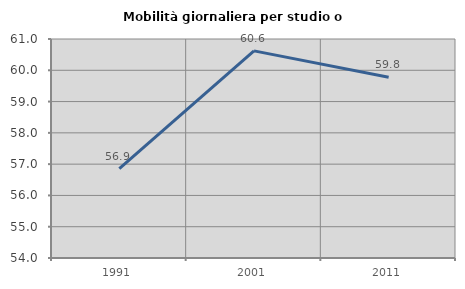
| Category | Mobilità giornaliera per studio o lavoro |
|---|---|
| 1991.0 | 56.86 |
| 2001.0 | 60.621 |
| 2011.0 | 59.778 |